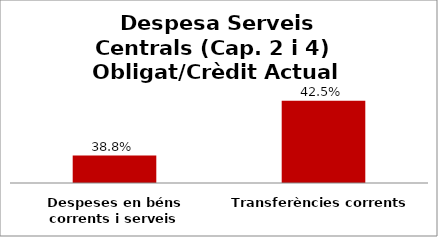
| Category | Series 0 |
|---|---|
| Despeses en béns corrents i serveis | 0.388 |
| Transferències corrents | 0.425 |